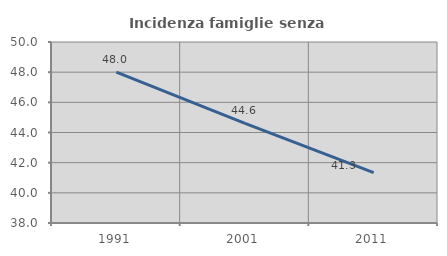
| Category | Incidenza famiglie senza nuclei |
|---|---|
| 1991.0 | 48 |
| 2001.0 | 44.604 |
| 2011.0 | 41.333 |